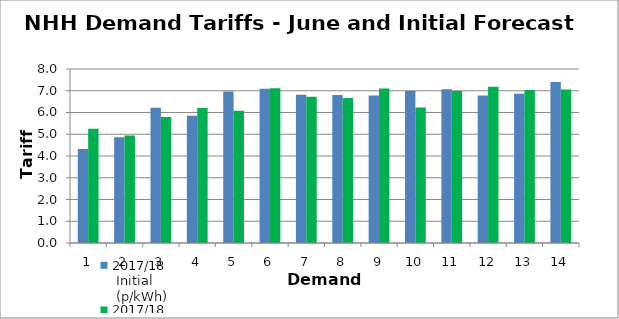
| Category | 2017/18
 Initial
 (p/kWh) | 2017/18
June
(p/kWh) |
|---|---|---|
| 0 | 4.327 | 5.252 |
| 1 | 4.866 | 4.939 |
| 2 | 6.221 | 5.794 |
| 3 | 5.853 | 6.202 |
| 4 | 6.962 | 6.085 |
| 5 | 7.088 | 7.111 |
| 6 | 6.812 | 6.727 |
| 7 | 6.806 | 6.667 |
| 8 | 6.786 | 7.105 |
| 9 | 6.99 | 6.227 |
| 10 | 7.07 | 6.987 |
| 11 | 6.779 | 7.18 |
| 12 | 6.866 | 7.04 |
| 13 | 7.405 | 7.059 |